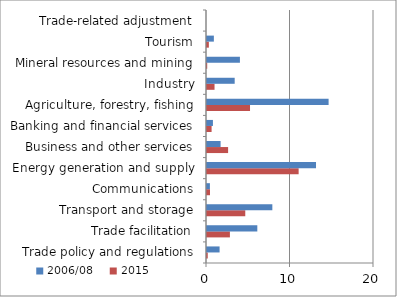
| Category | 2015 | 2006/08 |
|---|---|---|
| Trade policy and regulations | 0.09 | 1.507 |
| Trade facilitation | 2.743 | 6.026 |
| Transport and storage | 4.583 | 7.825 |
| Communications | 0.356 | 0.348 |
| Energy generation and supply | 10.974 | 13.055 |
| Business and other services | 2.527 | 1.628 |
| Banking and financial services | 0.55 | 0.709 |
| Agriculture, forestry, fishing | 5.152 | 14.563 |
| Industry | 0.902 | 3.316 |
| Mineral resources and mining | 0.024 | 3.943 |
| Tourism | 0.221 | 0.822 |
| Trade-related adjustment | 0 | 0 |